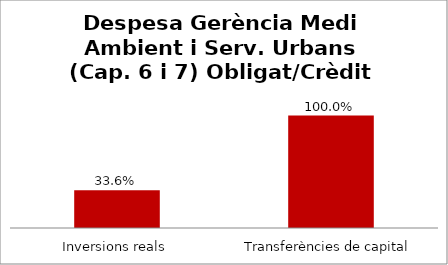
| Category | Series 0 |
|---|---|
| Inversions reals | 0.336 |
| Transferències de capital | 1 |